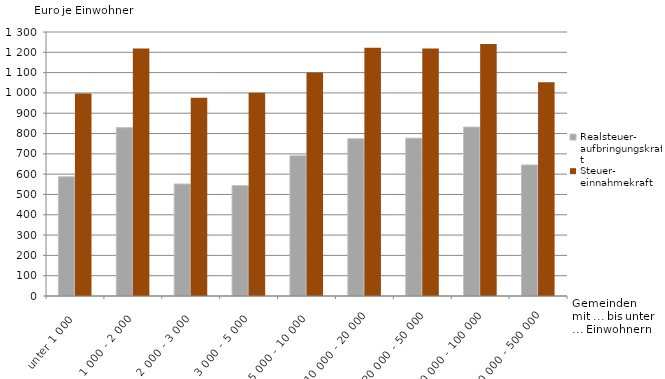
| Category | Realsteuer-
aufbringungskraft  | Steuer-
einnahmekraft  |
|---|---|---|
| unter 1 000 | 586.84 | 996.79 |
| 1 000 - 2 000 | 828.74 | 1219.02 |
| 2 000 - 3 000 | 551.22 | 976.08 |
| 3 000 - 5 000 | 543.53 | 1000.94 |
| 5 000 - 10 000 | 690.32 | 1100.92 |
| 10 000 - 20 000 | 773.81 | 1222.21 |
| 20 000 - 50 000 | 777.22 | 1218.53 |
| 50 000 - 100 000 | 831.72 | 1240.46 |
| 200 000 - 500 000 | 645.1 | 1052.94 |